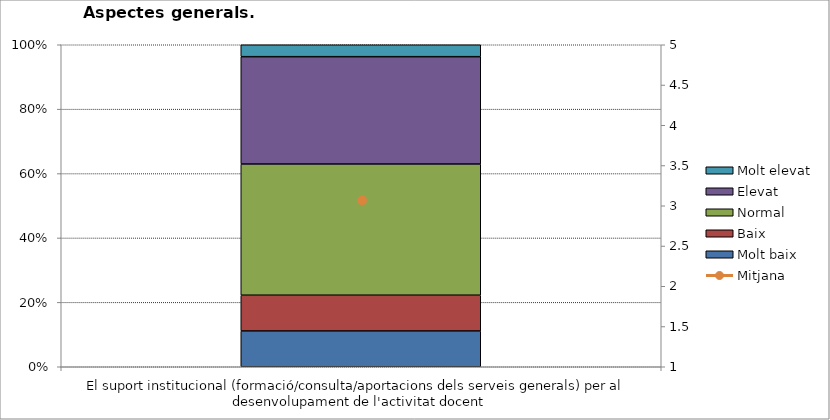
| Category | Molt baix | Baix | Normal  | Elevat | Molt elevat |
|---|---|---|---|---|---|
| El suport institucional (formació/consulta/aportacions dels serveis generals) per al desenvolupament de l'activitat docent | 3 | 3 | 11 | 9 | 1 |